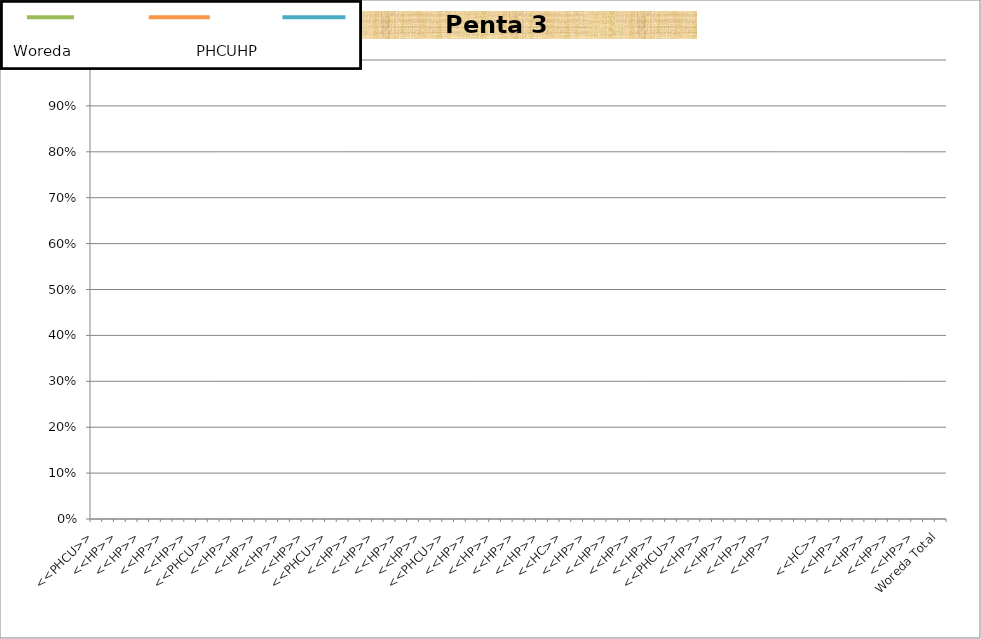
| Category | Penta 3 |
|---|---|
| <<PHCU>> | 0 |
| <<HC>> | 0 |
| <<HP>> | 0 |
| <<HP>> | 0 |
| <<HP>> | 0 |
| <<HP>> | 0 |
| <<HP>> | 0 |
| <<HP>> | 0 |
| <<HP>> | 0 |
|  | 0 |
| <<PHCU>> | 0 |
| <<HC>> | 0 |
| <<HP>> | 0 |
| <<HP>> | 0 |
| <<HP>> | 0 |
| <<HP>> | 0 |
| <<HP>> | 0 |
| <<HP>> | 0 |
| <<HP>> | 0 |
|  | 0 |
| <<PHCU>> | 0 |
| <<HC>> | 0 |
| <<HP>> | 0 |
| <<HP>> | 0 |
| <<HP>> | 0 |
| <<HP>> | 0 |
| <<HP>> | 0 |
| <<HP>> | 0 |
| <<HP>> | 0 |
|  | 0 |
| <<PHCU>> | 0 |
| <<HC>> | 0 |
| <<HP>> | 0 |
| <<HP>> | 0 |
| <<HP>> | 0 |
| <<HP>> | 0 |
| <<HP>> | 0 |
| <<HP>> | 0 |
| <<HP>> | 0 |
|  | 0 |
| <<HC>> | 0 |
| <<HP>> | 0 |
| <<HP>> | 0 |
| <<HP>> | 0 |
| <<HP>> | 0 |
| <<HP>> | 0 |
| <<HP>> | 0 |
| <<HP>> | 0 |
| <<HP>> | 0 |
|  | 0 |
| <<PHCU>> | 0 |
| <<HC>> | 0 |
| <<HP>> | 0 |
| <<HP>> | 0 |
| <<HP>> | 0 |
| <<HP>> | 0 |
| <<HP>> | 0 |
| <<HP>> | 0 |
| <<HP>> | 0 |
| <<HP>> | 0 |
|  | 0 |
| <<PHCU>> | 0 |
| <<HC>> | 0 |
| <<HP>> | 0 |
| <<HP>> | 0 |
| <<HP>> | 0 |
| <<HP>> | 0 |
| <<HP>> | 0 |
| <<HP>> | 0 |
| <<HP>> | 0 |
| <<HP>> | 0 |
|  | 0 |
| Woreda Total | 0 |